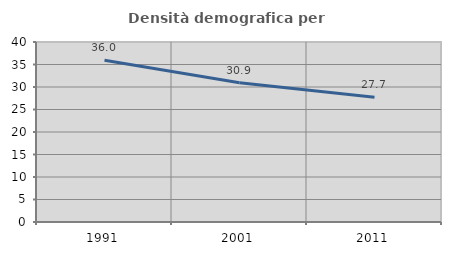
| Category | Densità demografica |
|---|---|
| 1991.0 | 35.952 |
| 2001.0 | 30.93 |
| 2011.0 | 27.718 |